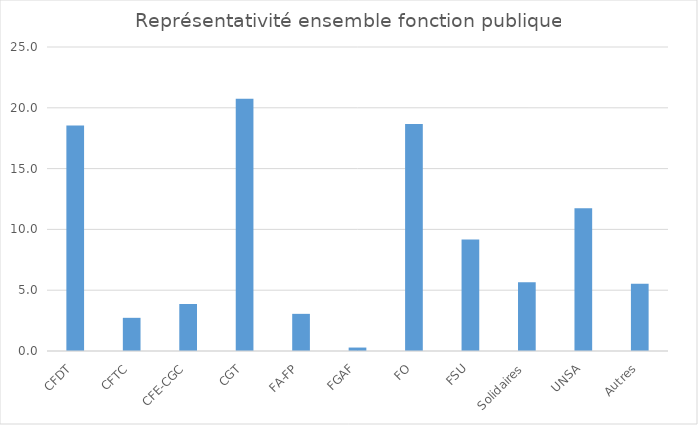
| Category | Series 0 |
|---|---|
| CFDT | 18.536 |
| CFTC | 2.728 |
| CFE-CGC | 3.867 |
| CGT | 20.751 |
| FA-FP | 3.055 |
| FGAF | 0.284 |
| FO | 18.675 |
| FSU | 9.179 |
| Solidaires | 5.662 |
| UNSA | 11.73 |
| Autres | 5.534 |